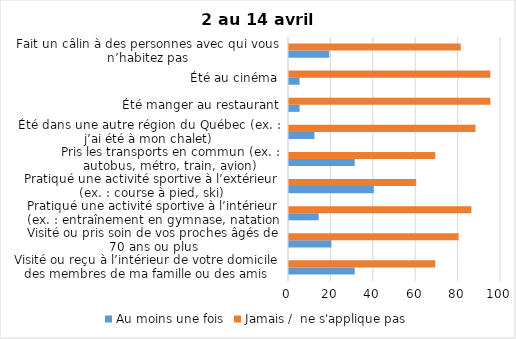
| Category | Au moins une fois | Jamais /  ne s'applique pas |
|---|---|---|
| Visité ou reçu à l’intérieur de votre domicile des membres de ma famille ou des amis | 31 | 69 |
| Visité ou pris soin de vos proches âgés de 70 ans ou plus | 20 | 80 |
| Pratiqué une activité sportive à l’intérieur (ex. : entraînement en gymnase, natation en piscine) | 14 | 86 |
| Pratiqué une activité sportive à l’extérieur (ex. : course à pied, ski) | 40 | 60 |
| Pris les transports en commun (ex. : autobus, métro, train, avion) | 31 | 69 |
| Été dans une autre région du Québec (ex. : j’ai été à mon chalet) | 12 | 88 |
| Été manger au restaurant | 5 | 95 |
| Été au cinéma | 5 | 95 |
| Fait un câlin à des personnes avec qui vous n’habitez pas | 19 | 81 |